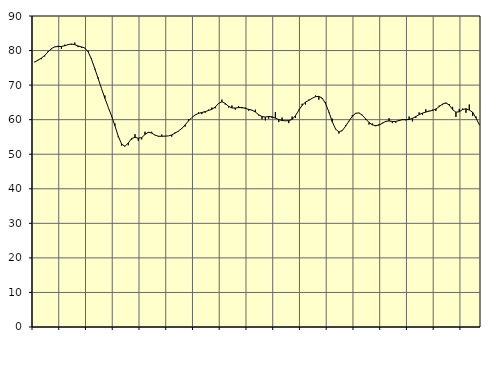
| Category | Piggar | Series 1 |
|---|---|---|
| nan | 76.8 | 76.65 |
| 87.0 | 77.3 | 77.22 |
| 87.0 | 77.5 | 77.82 |
| 87.0 | 78.3 | 78.58 |
| nan | 79.8 | 79.6 |
| 88.0 | 80.4 | 80.57 |
| 88.0 | 81 | 81.07 |
| 88.0 | 81.4 | 81.16 |
| nan | 80.5 | 81.2 |
| 89.0 | 81.7 | 81.38 |
| 89.0 | 81.8 | 81.72 |
| 89.0 | 81.7 | 81.9 |
| nan | 82.3 | 81.71 |
| 90.0 | 81 | 81.32 |
| 90.0 | 80.8 | 81.05 |
| 90.0 | 80.7 | 80.75 |
| nan | 79.9 | 79.63 |
| 91.0 | 77.8 | 77.47 |
| 91.0 | 74.5 | 74.74 |
| 91.0 | 72.2 | 71.86 |
| nan | 69 | 68.99 |
| 92.0 | 67 | 66.18 |
| 92.0 | 63.6 | 63.6 |
| 92.0 | 61 | 61.09 |
| nan | 58.9 | 58.22 |
| 93.0 | 54.9 | 55.22 |
| 93.0 | 52.5 | 52.93 |
| 93.0 | 52.4 | 52.29 |
| nan | 52.6 | 53.26 |
| 94.0 | 54.2 | 54.53 |
| 94.0 | 55.8 | 54.9 |
| 94.0 | 53.9 | 54.63 |
| nan | 54.3 | 54.81 |
| 95.0 | 56.5 | 55.71 |
| 95.0 | 56.2 | 56.37 |
| 95.0 | 56.5 | 56.13 |
| nan | 55.5 | 55.53 |
| 96.0 | 55.1 | 55.21 |
| 96.0 | 55.7 | 55.19 |
| 96.0 | 55.3 | 55.24 |
| nan | 55.3 | 55.3 |
| 97.0 | 55.1 | 55.58 |
| 97.0 | 56.3 | 56.11 |
| 97.0 | 56.6 | 56.7 |
| nan | 57.3 | 57.43 |
| 98.0 | 58 | 58.48 |
| 98.0 | 60.1 | 59.63 |
| 98.0 | 60.6 | 60.6 |
| nan | 61.4 | 61.37 |
| 99.0 | 62.1 | 61.81 |
| 99.0 | 61.6 | 62.09 |
| 99.0 | 62 | 62.34 |
| nan | 62.9 | 62.66 |
| 0.0 | 63.5 | 63 |
| 0.0 | 63.3 | 63.66 |
| 0.0 | 64.6 | 64.71 |
| nan | 65.8 | 65.19 |
| 1.0 | 64.4 | 64.7 |
| 1.0 | 63.5 | 63.85 |
| 1.0 | 64.1 | 63.4 |
| nan | 62.9 | 63.37 |
| 2.0 | 63.9 | 63.49 |
| 2.0 | 63.3 | 63.52 |
| 2.0 | 63.5 | 63.27 |
| nan | 62.6 | 62.98 |
| 3.0 | 62.7 | 62.77 |
| 3.0 | 62.9 | 62.21 |
| 3.0 | 61.2 | 61.42 |
| nan | 60.1 | 60.89 |
| 4.0 | 59.8 | 60.76 |
| 4.0 | 60.3 | 60.92 |
| 4.0 | 60.5 | 60.83 |
| nan | 62.2 | 60.43 |
| 5.0 | 59.3 | 60.04 |
| 5.0 | 60.6 | 59.75 |
| 5.0 | 59.7 | 59.67 |
| nan | 59 | 59.72 |
| 6.0 | 60.9 | 60.07 |
| 6.0 | 60.5 | 61.14 |
| 6.0 | 62.9 | 62.7 |
| nan | 64.6 | 64.15 |
| 7.0 | 64.4 | 65.08 |
| 7.0 | 65.8 | 65.6 |
| 7.0 | 66.2 | 66.18 |
| nan | 67 | 66.65 |
| 8.0 | 65.8 | 66.74 |
| 8.0 | 66 | 66.24 |
| 8.0 | 65.1 | 64.67 |
| nan | 62.1 | 62.24 |
| 9.0 | 60.3 | 59.42 |
| 9.0 | 57.2 | 57.29 |
| 9.0 | 56 | 56.44 |
| nan | 56.7 | 56.85 |
| 10.0 | 58.4 | 58.1 |
| 10.0 | 59.5 | 59.6 |
| 10.0 | 61.3 | 60.95 |
| nan | 61.7 | 61.85 |
| 11.0 | 62 | 61.95 |
| 11.0 | 61.4 | 61.28 |
| 11.0 | 59.9 | 60.24 |
| nan | 58.6 | 59.19 |
| 12.0 | 58.9 | 58.49 |
| 12.0 | 58.1 | 58.28 |
| 12.0 | 58.7 | 58.44 |
| nan | 59.1 | 58.95 |
| 13.0 | 59.3 | 59.51 |
| 13.0 | 60.4 | 59.64 |
| 13.0 | 59 | 59.47 |
| nan | 59.1 | 59.49 |
| 14.0 | 59.6 | 59.76 |
| 14.0 | 60.2 | 59.99 |
| 14.0 | 59.8 | 60 |
| nan | 60.9 | 60.05 |
| 15.0 | 59.5 | 60.38 |
| 15.0 | 60.5 | 60.9 |
| 15.0 | 62.1 | 61.46 |
| nan | 61.4 | 61.9 |
| 16.0 | 63 | 62.2 |
| 16.0 | 62.6 | 62.47 |
| 16.0 | 62.9 | 62.67 |
| nan | 62.5 | 63.08 |
| 17.0 | 64.1 | 63.77 |
| 17.0 | 64.2 | 64.52 |
| 17.0 | 64.7 | 64.87 |
| nan | 64.5 | 64.21 |
| 18.0 | 63.7 | 62.95 |
| 18.0 | 60.8 | 62.16 |
| 18.0 | 63.1 | 62.3 |
| nan | 63.2 | 62.93 |
| 19.0 | 62 | 63.16 |
| 19.0 | 64.4 | 62.79 |
| 19.0 | 61.1 | 62.15 |
| nan | 60.9 | 60.48 |
| 20.0 | 58.4 | 58.53 |